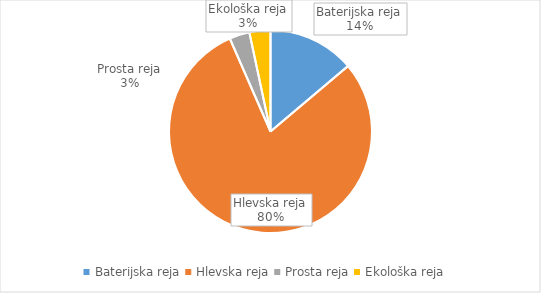
| Category | Količina kosov jajc |
|---|---|
| Baterijska reja | 431336 |
| Hlevska reja | 2480606 |
| Prosta reja | 100239 |
| Ekološka reja | 104304 |